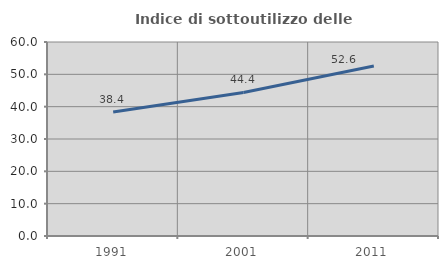
| Category | Indice di sottoutilizzo delle abitazioni  |
|---|---|
| 1991.0 | 38.364 |
| 2001.0 | 44.409 |
| 2011.0 | 52.562 |